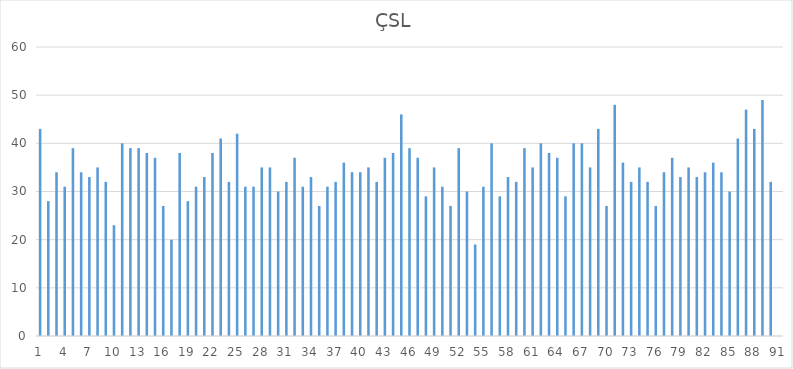
| Category | Series 0 |
|---|---|
| 0 | 43 |
| 1 | 28 |
| 2 | 34 |
| 3 | 31 |
| 4 | 39 |
| 5 | 34 |
| 6 | 33 |
| 7 | 35 |
| 8 | 32 |
| 9 | 23 |
| 10 | 40 |
| 11 | 39 |
| 12 | 39 |
| 13 | 38 |
| 14 | 37 |
| 15 | 27 |
| 16 | 20 |
| 17 | 38 |
| 18 | 28 |
| 19 | 31 |
| 20 | 33 |
| 21 | 38 |
| 22 | 41 |
| 23 | 32 |
| 24 | 42 |
| 25 | 31 |
| 26 | 31 |
| 27 | 35 |
| 28 | 35 |
| 29 | 30 |
| 30 | 32 |
| 31 | 37 |
| 32 | 31 |
| 33 | 33 |
| 34 | 27 |
| 35 | 31 |
| 36 | 32 |
| 37 | 36 |
| 38 | 34 |
| 39 | 34 |
| 40 | 35 |
| 41 | 32 |
| 42 | 37 |
| 43 | 38 |
| 44 | 46 |
| 45 | 39 |
| 46 | 37 |
| 47 | 29 |
| 48 | 35 |
| 49 | 31 |
| 50 | 27 |
| 51 | 39 |
| 52 | 30 |
| 53 | 19 |
| 54 | 31 |
| 55 | 40 |
| 56 | 29 |
| 57 | 33 |
| 58 | 32 |
| 59 | 39 |
| 60 | 35 |
| 61 | 40 |
| 62 | 38 |
| 63 | 37 |
| 64 | 29 |
| 65 | 40 |
| 66 | 40 |
| 67 | 35 |
| 68 | 43 |
| 69 | 27 |
| 70 | 48 |
| 71 | 36 |
| 72 | 32 |
| 73 | 35 |
| 74 | 32 |
| 75 | 27 |
| 76 | 34 |
| 77 | 37 |
| 78 | 33 |
| 79 | 35 |
| 80 | 33 |
| 81 | 34 |
| 82 | 36 |
| 83 | 34 |
| 84 | 30 |
| 85 | 41 |
| 86 | 47 |
| 87 | 43 |
| 88 | 49 |
| 89 | 32 |
| 90 | 0 |